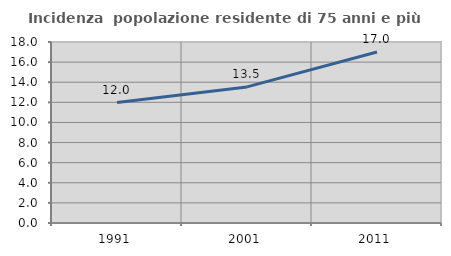
| Category | Incidenza  popolazione residente di 75 anni e più |
|---|---|
| 1991.0 | 11.981 |
| 2001.0 | 13.535 |
| 2011.0 | 17.011 |